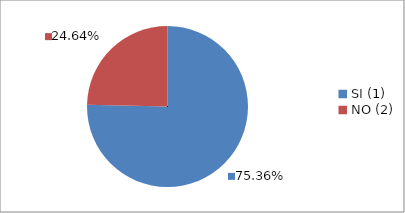
| Category | Series 0 |
|---|---|
| SI (1) | 0.754 |
| NO (2) | 0.246 |